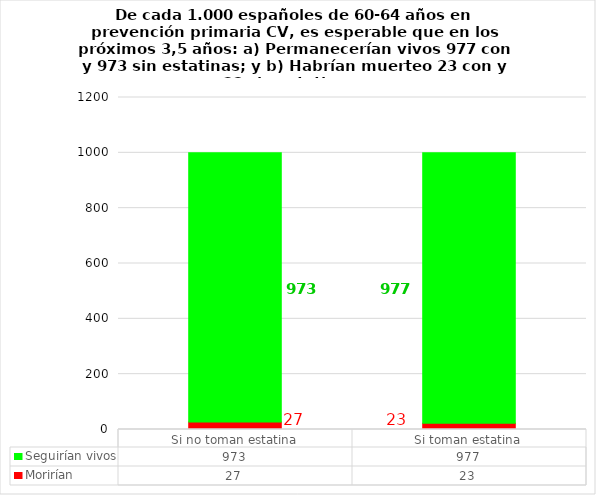
| Category | Morirían | Seguirían vivos |
|---|---|---|
| Si no toman estatina | 27 | 973 |
| Si toman estatina | 23 | 977 |